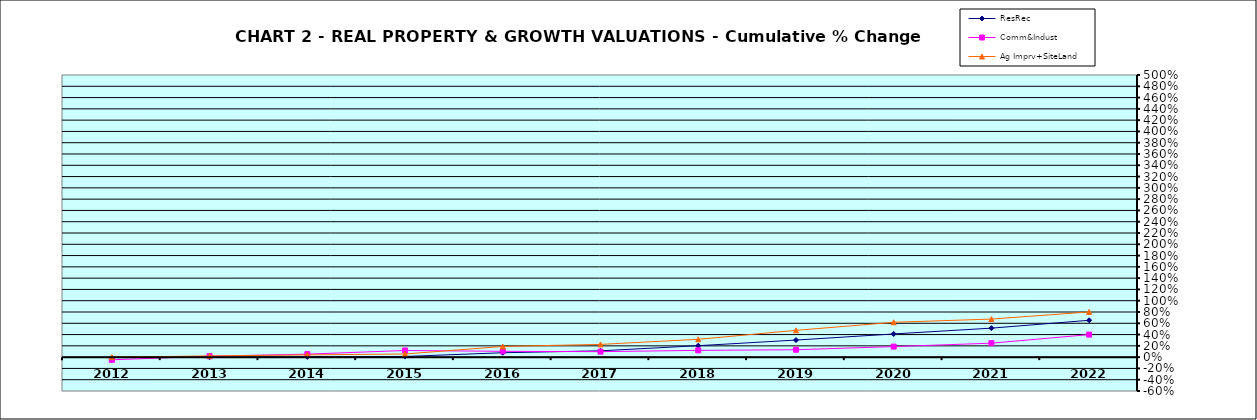
| Category | ResRec | Comm&Indust | Ag Imprv+SiteLand |
|---|---|---|---|
| 2012.0 | -0.008 | -0.047 | 0 |
| 2013.0 | -0.003 | 0.016 | 0.022 |
| 2014.0 | 0.005 | 0.053 | 0.04 |
| 2015.0 | 0.012 | 0.118 | 0.056 |
| 2016.0 | 0.078 | 0.103 | 0.189 |
| 2017.0 | 0.112 | 0.097 | 0.226 |
| 2018.0 | 0.203 | 0.12 | 0.316 |
| 2019.0 | 0.303 | 0.132 | 0.475 |
| 2020.0 | 0.411 | 0.187 | 0.617 |
| 2021.0 | 0.514 | 0.248 | 0.675 |
| 2022.0 | 0.653 | 0.399 | 0.801 |